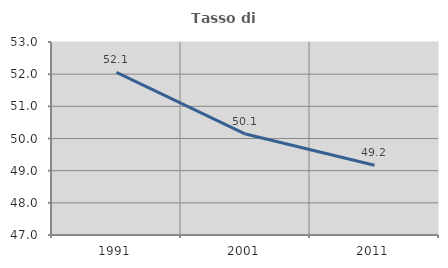
| Category | Tasso di occupazione   |
|---|---|
| 1991.0 | 52.055 |
| 2001.0 | 50.139 |
| 2011.0 | 49.167 |